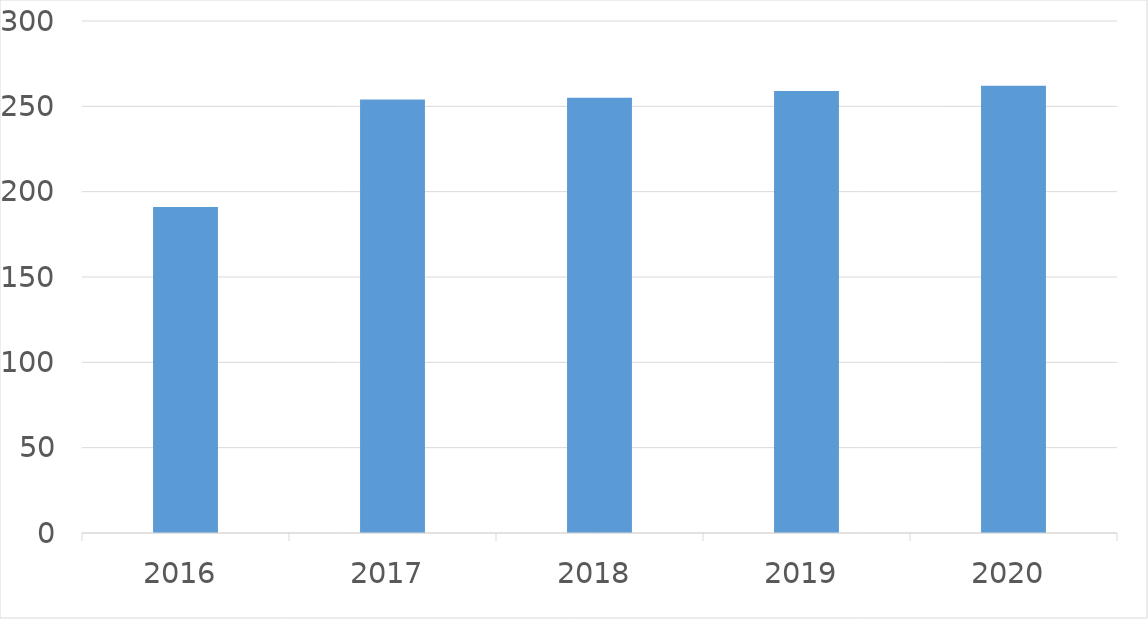
| Category | Series 0 |
|---|---|
| 2016 | 191 |
| 2017 | 254 |
| 2018 | 255 |
| 2019 | 259 |
| 2020 | 262 |